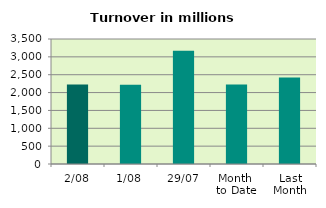
| Category | Series 0 |
|---|---|
| 2/08 | 2228.098 |
| 1/08 | 2220.188 |
| 29/07 | 3168.978 |
| Month 
to Date | 2224.143 |
| Last
Month | 2421.628 |